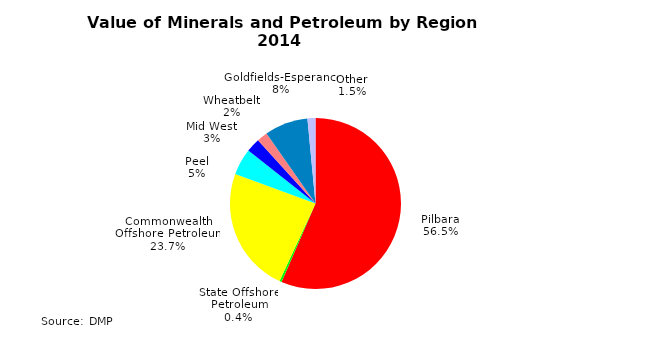
| Category | Series 0 |
|---|---|
| Pilbara | 64484673694 |
| State Offshore Petroleum | 470489559 |
| Commonwealth Offshore Petroleum | 27021378293 |
| Peel | 5738937583 |
| Mid West | 3009048845 |
| Wheatbelt | 2325953702 |
| Goldfields-Esperance | 9352932633 |
| Other | 1720278291 |